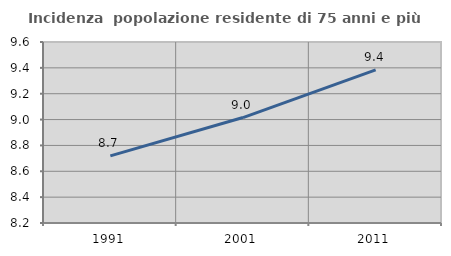
| Category | Incidenza  popolazione residente di 75 anni e più |
|---|---|
| 1991.0 | 8.719 |
| 2001.0 | 9.016 |
| 2011.0 | 9.384 |